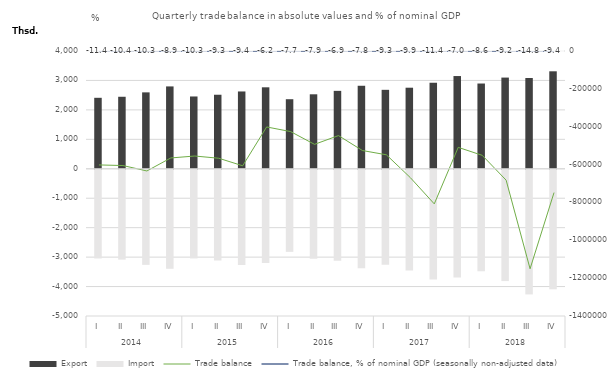
| Category | Export | Import |
|---|---|---|
| 0 | 2410554 | -3012408 |
| 1 | 2445824 | -3050934 |
| 2 | 2595124 | -3228907 |
| 3 | 2797101 | -3362089 |
| 4 | 2455721 | -3010550 |
| 5 | 2514576 | -3081107 |
| 6 | 2625995 | -3232309 |
| 7 | 2766919 | -3168167 |
| 8 | 2362629 | -2788307 |
| 9 | 2529501 | -3022638 |
| 10 | 2646360 | -3093254 |
| 11 | 2819214 | -3345021 |
| 12 | 2681232 | -3229657 |
| 13 | 2753268 | -3422217 |
| 14 | 2922867 | -3730515 |
| 15 | 3149666 | -3658685 |
| 16 | 2895537 | -3446567 |
| 17 | 3097284 | -3779666 |
| 18 | 3082224 | -4232729 |
| 19 | 3310711 | -4058796 |